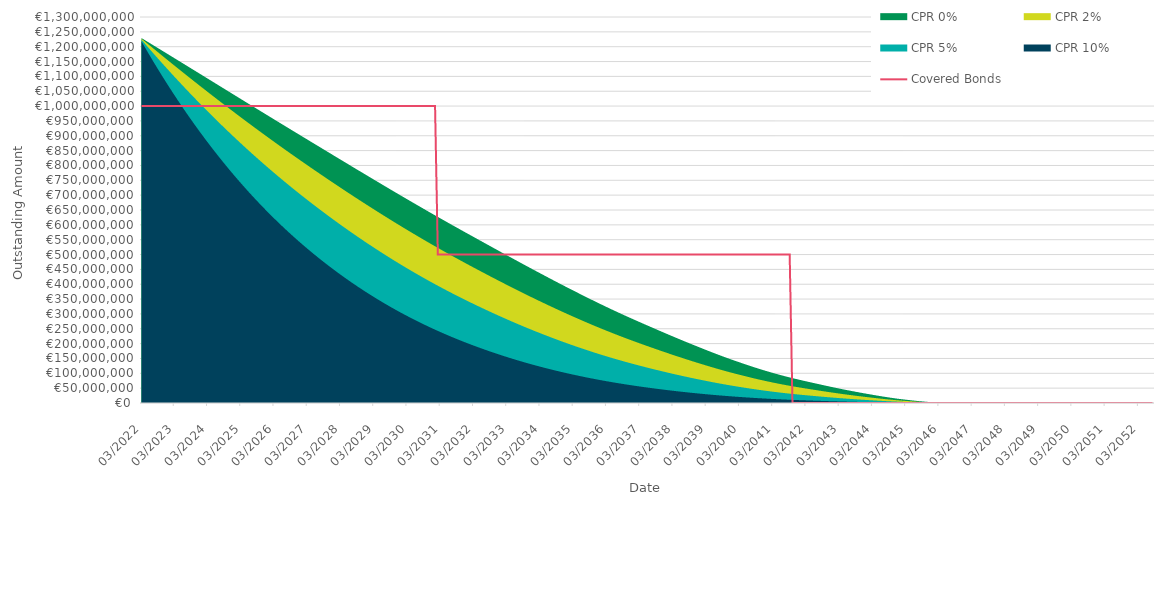
| Category | Covered Bonds |
|---|---|
| 2022-03-31 | 1000000000 |
| 2022-04-30 | 1000000000 |
| 2022-05-31 | 1000000000 |
| 2022-06-30 | 1000000000 |
| 2022-07-31 | 1000000000 |
| 2022-08-31 | 1000000000 |
| 2022-09-30 | 1000000000 |
| 2022-10-31 | 1000000000 |
| 2022-11-30 | 1000000000 |
| 2022-12-31 | 1000000000 |
| 2023-01-31 | 1000000000 |
| 2023-02-28 | 1000000000 |
| 2023-03-31 | 1000000000 |
| 2023-04-30 | 1000000000 |
| 2023-05-31 | 1000000000 |
| 2023-06-30 | 1000000000 |
| 2023-07-31 | 1000000000 |
| 2023-08-31 | 1000000000 |
| 2023-09-30 | 1000000000 |
| 2023-10-31 | 1000000000 |
| 2023-11-30 | 1000000000 |
| 2023-12-31 | 1000000000 |
| 2024-01-31 | 1000000000 |
| 2024-02-29 | 1000000000 |
| 2024-03-31 | 1000000000 |
| 2024-04-30 | 1000000000 |
| 2024-05-31 | 1000000000 |
| 2024-06-30 | 1000000000 |
| 2024-07-31 | 1000000000 |
| 2024-08-31 | 1000000000 |
| 2024-09-30 | 1000000000 |
| 2024-10-31 | 1000000000 |
| 2024-11-30 | 1000000000 |
| 2024-12-31 | 1000000000 |
| 2025-01-31 | 1000000000 |
| 2025-02-28 | 1000000000 |
| 2025-03-31 | 1000000000 |
| 2025-04-30 | 1000000000 |
| 2025-05-31 | 1000000000 |
| 2025-06-30 | 1000000000 |
| 2025-07-31 | 1000000000 |
| 2025-08-31 | 1000000000 |
| 2025-09-30 | 1000000000 |
| 2025-10-31 | 1000000000 |
| 2025-11-30 | 1000000000 |
| 2025-12-31 | 1000000000 |
| 2026-01-31 | 1000000000 |
| 2026-02-28 | 1000000000 |
| 2026-03-31 | 1000000000 |
| 2026-04-30 | 1000000000 |
| 2026-05-31 | 1000000000 |
| 2026-06-30 | 1000000000 |
| 2026-07-31 | 1000000000 |
| 2026-08-31 | 1000000000 |
| 2026-09-30 | 1000000000 |
| 2026-10-31 | 1000000000 |
| 2026-11-30 | 1000000000 |
| 2026-12-31 | 1000000000 |
| 2027-01-31 | 1000000000 |
| 2027-02-28 | 1000000000 |
| 2027-03-31 | 1000000000 |
| 2027-04-30 | 1000000000 |
| 2027-05-31 | 1000000000 |
| 2027-06-30 | 1000000000 |
| 2027-07-31 | 1000000000 |
| 2027-08-31 | 1000000000 |
| 2027-09-30 | 1000000000 |
| 2027-10-31 | 1000000000 |
| 2027-11-30 | 1000000000 |
| 2027-12-31 | 1000000000 |
| 2028-01-31 | 1000000000 |
| 2028-02-29 | 1000000000 |
| 2028-03-31 | 1000000000 |
| 2028-04-30 | 1000000000 |
| 2028-05-31 | 1000000000 |
| 2028-06-30 | 1000000000 |
| 2028-07-31 | 1000000000 |
| 2028-08-31 | 1000000000 |
| 2028-09-30 | 1000000000 |
| 2028-10-31 | 1000000000 |
| 2028-11-30 | 1000000000 |
| 2028-12-31 | 1000000000 |
| 2029-01-31 | 1000000000 |
| 2029-02-28 | 1000000000 |
| 2029-03-31 | 1000000000 |
| 2029-04-30 | 1000000000 |
| 2029-05-31 | 1000000000 |
| 2029-06-30 | 1000000000 |
| 2029-07-31 | 1000000000 |
| 2029-08-31 | 1000000000 |
| 2029-09-30 | 1000000000 |
| 2029-10-31 | 1000000000 |
| 2029-11-30 | 1000000000 |
| 2029-12-31 | 1000000000 |
| 2030-01-31 | 1000000000 |
| 2030-02-28 | 1000000000 |
| 2030-03-31 | 1000000000 |
| 2030-04-30 | 1000000000 |
| 2030-05-31 | 1000000000 |
| 2030-06-30 | 1000000000 |
| 2030-07-31 | 1000000000 |
| 2030-08-31 | 1000000000 |
| 2030-09-30 | 1000000000 |
| 2030-10-31 | 1000000000 |
| 2030-11-30 | 1000000000 |
| 2030-12-31 | 1000000000 |
| 2031-01-31 | 1000000000 |
| 2031-02-28 | 500000000 |
| 2031-03-31 | 500000000 |
| 2031-04-30 | 500000000 |
| 2031-05-31 | 500000000 |
| 2031-06-30 | 500000000 |
| 2031-07-31 | 500000000 |
| 2031-08-31 | 500000000 |
| 2031-09-30 | 500000000 |
| 2031-10-31 | 500000000 |
| 2031-11-30 | 500000000 |
| 2031-12-31 | 500000000 |
| 2032-01-31 | 500000000 |
| 2032-02-29 | 500000000 |
| 2032-03-31 | 500000000 |
| 2032-04-30 | 500000000 |
| 2032-05-31 | 500000000 |
| 2032-06-30 | 500000000 |
| 2032-07-31 | 500000000 |
| 2032-08-31 | 500000000 |
| 2032-09-30 | 500000000 |
| 2032-10-31 | 500000000 |
| 2032-11-30 | 500000000 |
| 2032-12-31 | 500000000 |
| 2033-01-31 | 500000000 |
| 2033-02-28 | 500000000 |
| 2033-03-31 | 500000000 |
| 2033-04-30 | 500000000 |
| 2033-05-31 | 500000000 |
| 2033-06-30 | 500000000 |
| 2033-07-31 | 500000000 |
| 2033-08-31 | 500000000 |
| 2033-09-30 | 500000000 |
| 2033-10-31 | 500000000 |
| 2033-11-30 | 500000000 |
| 2033-12-31 | 500000000 |
| 2034-01-31 | 500000000 |
| 2034-02-28 | 500000000 |
| 2034-03-31 | 500000000 |
| 2034-04-30 | 500000000 |
| 2034-05-31 | 500000000 |
| 2034-06-30 | 500000000 |
| 2034-07-31 | 500000000 |
| 2034-08-31 | 500000000 |
| 2034-09-30 | 500000000 |
| 2034-10-31 | 500000000 |
| 2034-11-30 | 500000000 |
| 2034-12-31 | 500000000 |
| 2035-01-31 | 500000000 |
| 2035-02-28 | 500000000 |
| 2035-03-31 | 500000000 |
| 2035-04-30 | 500000000 |
| 2035-05-31 | 500000000 |
| 2035-06-30 | 500000000 |
| 2035-07-31 | 500000000 |
| 2035-08-31 | 500000000 |
| 2035-09-30 | 500000000 |
| 2035-10-31 | 500000000 |
| 2035-11-30 | 500000000 |
| 2035-12-31 | 500000000 |
| 2036-01-31 | 500000000 |
| 2036-02-29 | 500000000 |
| 2036-03-31 | 500000000 |
| 2036-04-30 | 500000000 |
| 2036-05-31 | 500000000 |
| 2036-06-30 | 500000000 |
| 2036-07-31 | 500000000 |
| 2036-08-31 | 500000000 |
| 2036-09-30 | 500000000 |
| 2036-10-31 | 500000000 |
| 2036-11-30 | 500000000 |
| 2036-12-31 | 500000000 |
| 2037-01-31 | 500000000 |
| 2037-02-28 | 500000000 |
| 2037-03-31 | 500000000 |
| 2037-04-30 | 500000000 |
| 2037-05-31 | 500000000 |
| 2037-06-30 | 500000000 |
| 2037-07-31 | 500000000 |
| 2037-08-31 | 500000000 |
| 2037-09-30 | 500000000 |
| 2037-10-31 | 500000000 |
| 2037-11-30 | 500000000 |
| 2037-12-31 | 500000000 |
| 2038-01-31 | 500000000 |
| 2038-02-28 | 500000000 |
| 2038-03-31 | 500000000 |
| 2038-04-30 | 500000000 |
| 2038-05-31 | 500000000 |
| 2038-06-30 | 500000000 |
| 2038-07-31 | 500000000 |
| 2038-08-31 | 500000000 |
| 2038-09-30 | 500000000 |
| 2038-10-31 | 500000000 |
| 2038-11-30 | 500000000 |
| 2038-12-31 | 500000000 |
| 2039-01-31 | 500000000 |
| 2039-02-28 | 500000000 |
| 2039-03-31 | 500000000 |
| 2039-04-30 | 500000000 |
| 2039-05-31 | 500000000 |
| 2039-06-30 | 500000000 |
| 2039-07-31 | 500000000 |
| 2039-08-31 | 500000000 |
| 2039-09-30 | 500000000 |
| 2039-10-31 | 500000000 |
| 2039-11-30 | 500000000 |
| 2039-12-31 | 500000000 |
| 2040-01-31 | 500000000 |
| 2040-02-29 | 500000000 |
| 2040-03-31 | 500000000 |
| 2040-04-30 | 500000000 |
| 2040-05-31 | 500000000 |
| 2040-06-30 | 500000000 |
| 2040-07-31 | 500000000 |
| 2040-08-31 | 500000000 |
| 2040-09-30 | 500000000 |
| 2040-10-31 | 500000000 |
| 2040-11-30 | 500000000 |
| 2040-12-31 | 500000000 |
| 2041-01-31 | 500000000 |
| 2041-02-28 | 500000000 |
| 2041-03-31 | 500000000 |
| 2041-04-30 | 500000000 |
| 2041-05-31 | 500000000 |
| 2041-06-30 | 500000000 |
| 2041-07-31 | 500000000 |
| 2041-08-31 | 500000000 |
| 2041-09-30 | 500000000 |
| 2041-10-31 | 0 |
| 2041-11-30 | 0 |
| 2041-12-31 | 0 |
| 2042-01-31 | 0 |
| 2042-02-28 | 0 |
| 2042-03-31 | 0 |
| 2042-04-30 | 0 |
| 2042-05-31 | 0 |
| 2042-06-30 | 0 |
| 2042-07-31 | 0 |
| 2042-08-31 | 0 |
| 2042-09-30 | 0 |
| 2042-10-31 | 0 |
| 2042-11-30 | 0 |
| 2042-12-31 | 0 |
| 2043-01-31 | 0 |
| 2043-02-28 | 0 |
| 2043-03-31 | 0 |
| 2043-04-30 | 0 |
| 2043-05-31 | 0 |
| 2043-06-30 | 0 |
| 2043-07-31 | 0 |
| 2043-08-31 | 0 |
| 2043-09-30 | 0 |
| 2043-10-31 | 0 |
| 2043-11-30 | 0 |
| 2043-12-31 | 0 |
| 2044-01-31 | 0 |
| 2044-02-29 | 0 |
| 2044-03-31 | 0 |
| 2044-04-30 | 0 |
| 2044-05-31 | 0 |
| 2044-06-30 | 0 |
| 2044-07-31 | 0 |
| 2044-08-31 | 0 |
| 2044-09-30 | 0 |
| 2044-10-31 | 0 |
| 2044-11-30 | 0 |
| 2044-12-31 | 0 |
| 2045-01-31 | 0 |
| 2045-02-28 | 0 |
| 2045-03-31 | 0 |
| 2045-04-30 | 0 |
| 2045-05-31 | 0 |
| 2045-06-30 | 0 |
| 2045-07-31 | 0 |
| 2045-08-31 | 0 |
| 2045-09-30 | 0 |
| 2045-10-31 | 0 |
| 2045-11-30 | 0 |
| 2045-12-31 | 0 |
| 2046-01-31 | 0 |
| 2046-02-28 | 0 |
| 2046-03-31 | 0 |
| 2046-04-30 | 0 |
| 2046-05-31 | 0 |
| 2046-06-30 | 0 |
| 2046-07-31 | 0 |
| 2046-08-31 | 0 |
| 2046-09-30 | 0 |
| 2046-10-31 | 0 |
| 2046-11-30 | 0 |
| 2046-12-31 | 0 |
| 2047-01-31 | 0 |
| 2047-02-28 | 0 |
| 2047-03-31 | 0 |
| 2047-04-30 | 0 |
| 2047-05-31 | 0 |
| 2047-06-30 | 0 |
| 2047-07-31 | 0 |
| 2047-08-31 | 0 |
| 2047-09-30 | 0 |
| 2047-10-31 | 0 |
| 2047-11-30 | 0 |
| 2047-12-31 | 0 |
| 2048-01-31 | 0 |
| 2048-02-29 | 0 |
| 2048-03-31 | 0 |
| 2048-04-30 | 0 |
| 2048-05-31 | 0 |
| 2048-06-30 | 0 |
| 2048-07-31 | 0 |
| 2048-08-31 | 0 |
| 2048-09-30 | 0 |
| 2048-10-31 | 0 |
| 2048-11-30 | 0 |
| 2048-12-31 | 0 |
| 2049-01-31 | 0 |
| 2049-02-28 | 0 |
| 2049-03-31 | 0 |
| 2049-04-30 | 0 |
| 2049-05-31 | 0 |
| 2049-06-30 | 0 |
| 2049-07-31 | 0 |
| 2049-08-31 | 0 |
| 2049-09-30 | 0 |
| 2049-10-31 | 0 |
| 2049-11-30 | 0 |
| 2049-12-31 | 0 |
| 2050-01-31 | 0 |
| 2050-02-28 | 0 |
| 2050-03-31 | 0 |
| 2050-04-30 | 0 |
| 2050-05-31 | 0 |
| 2050-06-30 | 0 |
| 2050-07-31 | 0 |
| 2050-08-31 | 0 |
| 2050-09-30 | 0 |
| 2050-10-31 | 0 |
| 2050-11-30 | 0 |
| 2050-12-31 | 0 |
| 2051-01-31 | 0 |
| 2051-02-28 | 0 |
| 2051-03-31 | 0 |
| 2051-04-30 | 0 |
| 2051-05-31 | 0 |
| 2051-06-30 | 0 |
| 2051-07-31 | 0 |
| 2051-08-31 | 0 |
| 2051-09-30 | 0 |
| 2051-10-31 | 0 |
| 2051-11-30 | 0 |
| 2051-12-31 | 0 |
| 2052-01-31 | 0 |
| 2052-02-29 | 0 |
| 2052-03-31 | 0 |
| 2052-04-30 | 0 |
| 2052-05-31 | 0 |
| 2052-06-30 | 0 |
| 2052-07-31 | 0 |
| 2052-08-31 | 0 |